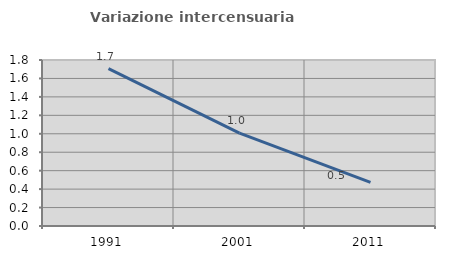
| Category | Variazione intercensuaria annua |
|---|---|
| 1991.0 | 1.706 |
| 2001.0 | 1.007 |
| 2011.0 | 0.474 |